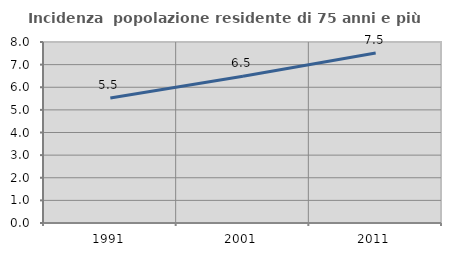
| Category | Incidenza  popolazione residente di 75 anni e più |
|---|---|
| 1991.0 | 5.528 |
| 2001.0 | 6.482 |
| 2011.0 | 7.515 |